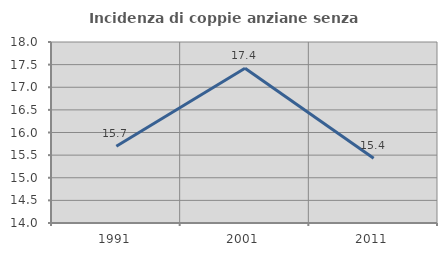
| Category | Incidenza di coppie anziane senza figli  |
|---|---|
| 1991.0 | 15.696 |
| 2001.0 | 17.422 |
| 2011.0 | 15.43 |